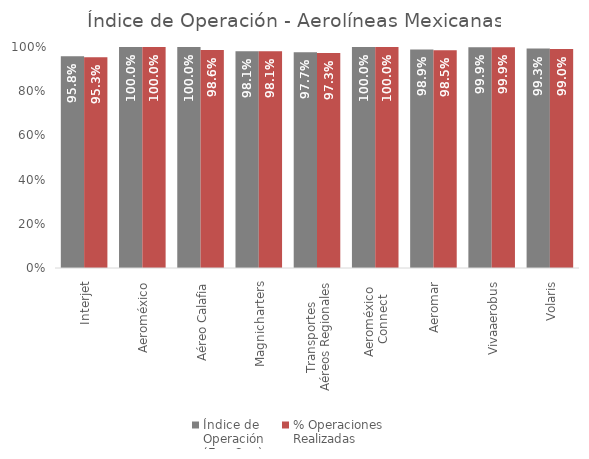
| Category | Índice de 
Operación
(Ene-Sep) | % Operaciones
Realizadas |
|---|---|---|
| Interjet | 0.958 | 0.953 |
| Aeroméxico | 1 | 1 |
| Aéreo Calafia | 1 | 0.986 |
| Magnicharters | 0.981 | 0.981 |
| Transportes 
Aéreos Regionales | 0.977 | 0.973 |
| Aeroméxico 
Connect | 1 | 1 |
| Aeromar | 0.989 | 0.985 |
| Vivaaerobus | 0.999 | 0.999 |
| Volaris | 0.993 | 0.99 |